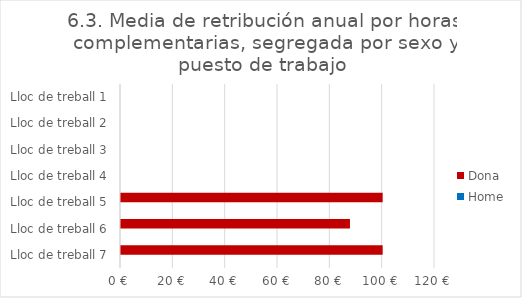
| Category | Dona | Home |
|---|---|---|
| Lloc de treball 1 | 0 | 0 |
| Lloc de treball 2 | 0 | 0 |
| Lloc de treball 3 | 0 | 0 |
| Lloc de treball 4 | 0 | 0 |
| Lloc de treball 5 | 100 | 0 |
| Lloc de treball 6 | 87.5 | 0 |
| Lloc de treball 7 | 100 | 0 |